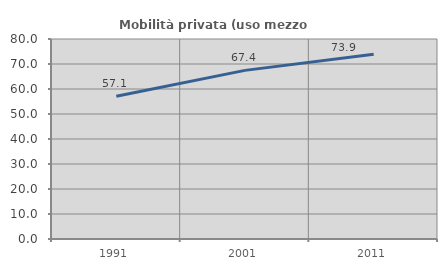
| Category | Mobilità privata (uso mezzo privato) |
|---|---|
| 1991.0 | 57.136 |
| 2001.0 | 67.448 |
| 2011.0 | 73.899 |